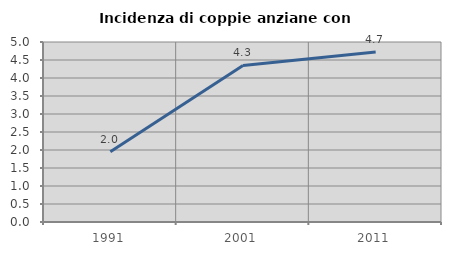
| Category | Incidenza di coppie anziane con figli |
|---|---|
| 1991.0 | 1.953 |
| 2001.0 | 4.348 |
| 2011.0 | 4.721 |